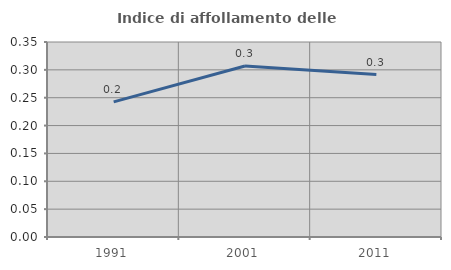
| Category | Indice di affollamento delle abitazioni  |
|---|---|
| 1991.0 | 0.243 |
| 2001.0 | 0.307 |
| 2011.0 | 0.292 |